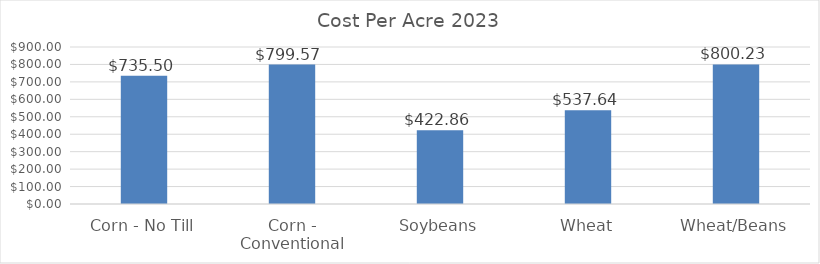
| Category | 2023 |
|---|---|
| Corn - No Till | 735.503 |
| Corn - Conventional | 799.573 |
| Soybeans | 422.857 |
| Wheat | 537.639 |
| Wheat/Beans | 800.227 |